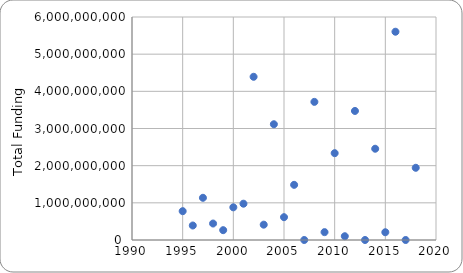
| Category | Funding |
|---|---|
| 2018.0 | 1942952170.36 |
| 2017.0 | 0 |
| 2016.0 | 5603445573.24 |
| 2015.0 | 208574064 |
| 2014.0 | 2455547690 |
| 2013.0 | 0 |
| 2012.0 | 3472133641 |
| 2011.0 | 101346262 |
| 2010.0 | 2336280621 |
| 2009.0 | 211433756 |
| 2008.0 | 3716341634 |
| 2007.0 | 0 |
| 2006.0 | 1484384260 |
| 2005.0 | 613798894 |
| 2004.0 | 3114208724 |
| 2003.0 | 412752171 |
| 2002.0 | 4391229308 |
| 2001.0 | 976527098 |
| 2000.0 | 879320177 |
| 1999.0 | 264337731 |
| 1998.0 | 443143103 |
| 1997.0 | 1135806985 |
| 1996.0 | 390009961 |
| 1995.0 | 775731766 |